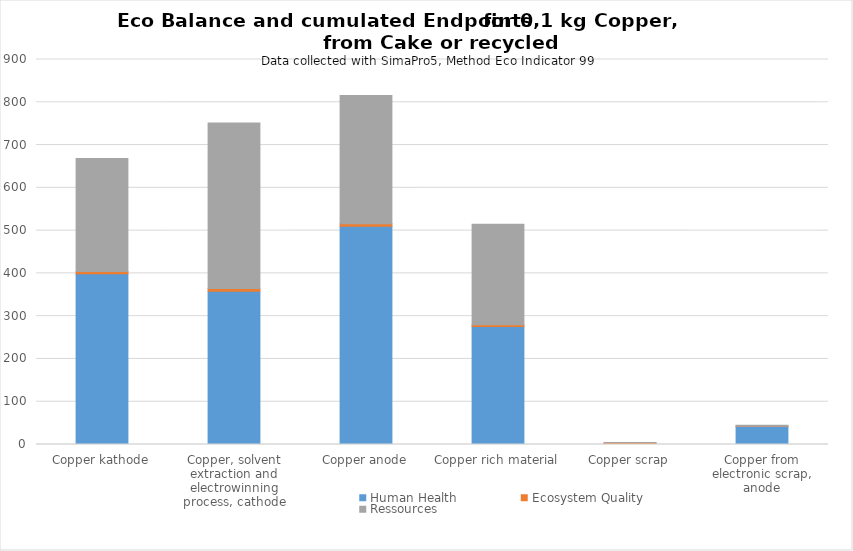
| Category | Human Health | Ecosystem Quality | Ressources |
|---|---|---|---|
| Copper kathode | 399 | 5.34 | 264 |
| Copper, solvent extraction and electrowinning process, cathode | 358 | 6.69 | 387 |
| Copper anode | 510 | 5.99 | 300 |
| Copper rich material | 276 | 3.71 | 235 |
| Copper scrap | 1.17 | 3.58 | 0.115 |
| Copper from electronic scrap, anode | 41.9 | 0.521 | 2.61 |